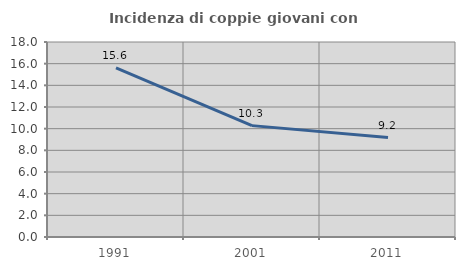
| Category | Incidenza di coppie giovani con figli |
|---|---|
| 1991.0 | 15.616 |
| 2001.0 | 10.28 |
| 2011.0 | 9.183 |